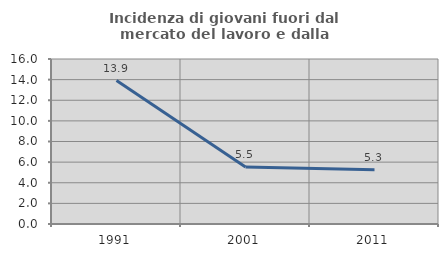
| Category | Incidenza di giovani fuori dal mercato del lavoro e dalla formazione  |
|---|---|
| 1991.0 | 13.911 |
| 2001.0 | 5.521 |
| 2011.0 | 5.263 |